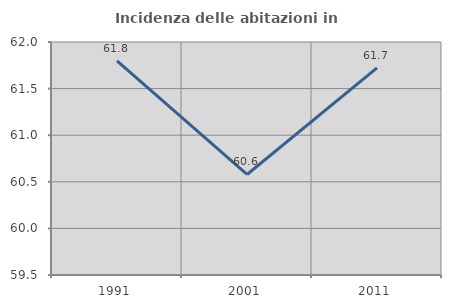
| Category | Incidenza delle abitazioni in proprietà  |
|---|---|
| 1991.0 | 61.797 |
| 2001.0 | 60.579 |
| 2011.0 | 61.722 |